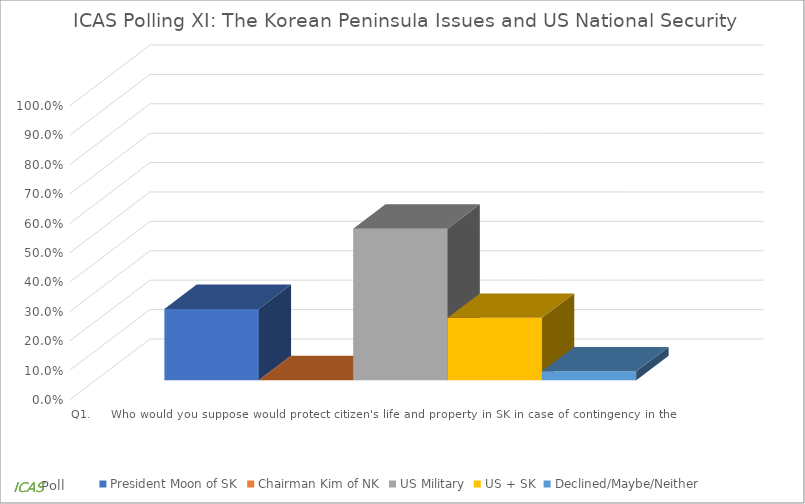
| Category | President Moon of SK | Chairman Kim of NK | US Military | US + SK | Declined/Maybe/Neither |
|---|---|---|---|---|---|
| Q1.     Who would you suppose would protect citizen's life and property in SK in case of contingency in the Korean Peninsula? | 0.242 | 0 | 0.515 | 0.212 | 0.03 |